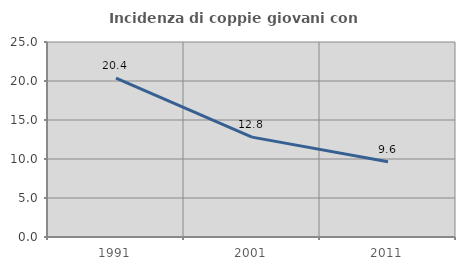
| Category | Incidenza di coppie giovani con figli |
|---|---|
| 1991.0 | 20.358 |
| 2001.0 | 12.804 |
| 2011.0 | 9.646 |